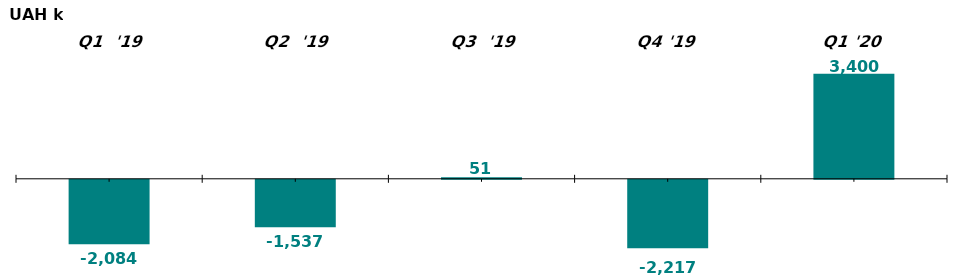
| Category | Net Flow of Capital in Q1 2019-20, UAH k |
|---|---|
| Q1  '19 | -2083.653 |
| Q2  '19 | -1537.385 |
| Q3  '19 | 50.954 |
| Q4 '19 | -2216.998 |
| Q1 '20 | 3400.023 |